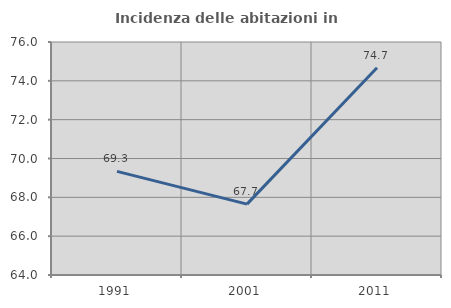
| Category | Incidenza delle abitazioni in proprietà  |
|---|---|
| 1991.0 | 69.337 |
| 2001.0 | 67.652 |
| 2011.0 | 74.677 |